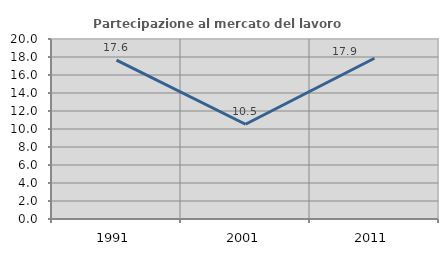
| Category | Partecipazione al mercato del lavoro  femminile |
|---|---|
| 1991.0 | 17.647 |
| 2001.0 | 10.526 |
| 2011.0 | 17.857 |